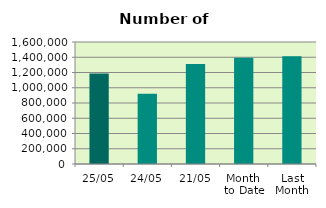
| Category | Series 0 |
|---|---|
| 25/05 | 1185596 |
| 24/05 | 920684 |
| 21/05 | 1310934 |
| Month 
to Date | 1393477.176 |
| Last
Month | 1414476.2 |